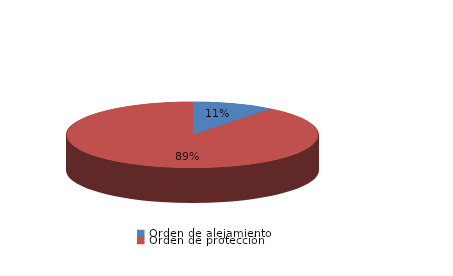
| Category | Series 0 |
|---|---|
| Orden de alejamiento | 4 |
| Orden de protección | 34 |